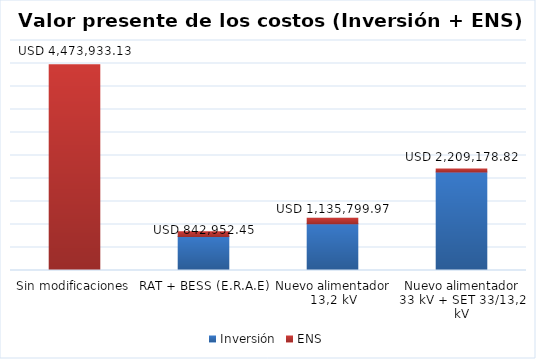
| Category | Inversión | ENS |
|---|---|---|
| Sin modificaciones | 0 | 4473933.128 |
| RAT + BESS (E.R.A.E) | 740498.002 | 102454.444 |
| Nuevo alimentador 13,2 kV | 1017792.117 | 118007.851 |
| Nuevo alimentador 33 kV + SET 33/13,2 kV | 2142478.733 | 66700.09 |